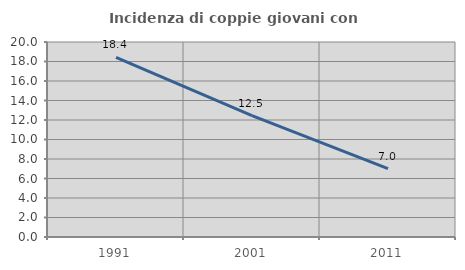
| Category | Incidenza di coppie giovani con figli |
|---|---|
| 1991.0 | 18.427 |
| 2001.0 | 12.456 |
| 2011.0 | 7.008 |